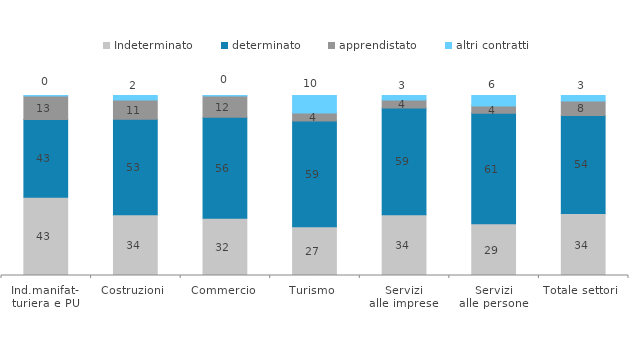
| Category | Indeterminato | determinato | apprendistato | altri contratti |
|---|---|---|---|---|
| Ind.manifat-
turiera e PU | 43.456 | 43.173 | 13.136 | 0.235 |
| Costruzioni | 33.766 | 53.084 | 10.714 | 2.435 |
| Commercio | 31.743 | 56.147 | 11.835 | 0.275 |
| Turismo | 27.06 | 58.805 | 4.362 | 9.774 |
| Servizi
alle imprese | 33.802 | 59.292 | 4.39 | 2.515 |
| Servizi
alle persone | 28.731 | 61.359 | 4.12 | 5.791 |
| Totale settori | 34.444 | 54.451 | 8.037 | 3.068 |